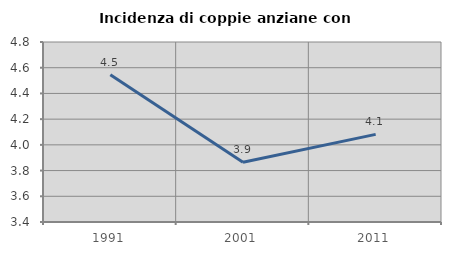
| Category | Incidenza di coppie anziane con figli |
|---|---|
| 1991.0 | 4.545 |
| 2001.0 | 3.865 |
| 2011.0 | 4.082 |